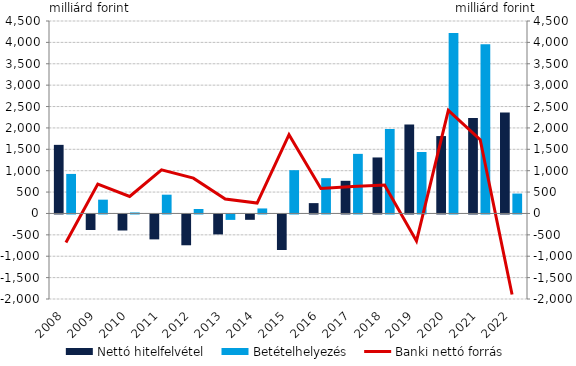
| Category | Nettó hitelfelvétel | Betételhelyezés |
|---|---|---|
| 2008.0 | 1604.117 | 924.526 |
| 2009.0 | -363.024 | 322.449 |
| 2010.0 | -375.15 | 23.517 |
| 2011.0 | -582.414 | 439.017 |
| 2012.0 | -720.502 | 104.961 |
| 2013.0 | -466.305 | -126.817 |
| 2014.0 | -125.073 | 117.279 |
| 2015.0 | -830.803 | 1012.037 |
| 2016.0 | 241.811 | 825.492 |
| 2017.0 | 763.636 | 1393.586 |
| 2018.0 | 1309.413 | 1976.26 |
| 2019.0 | 2081.059 | 1436.854 |
| 2020.0 | 1809.578 | 4222.034 |
| 2021.0 | 2232.173 | 3957.458 |
| 2022.0 | 2358.507 | 465.289 |